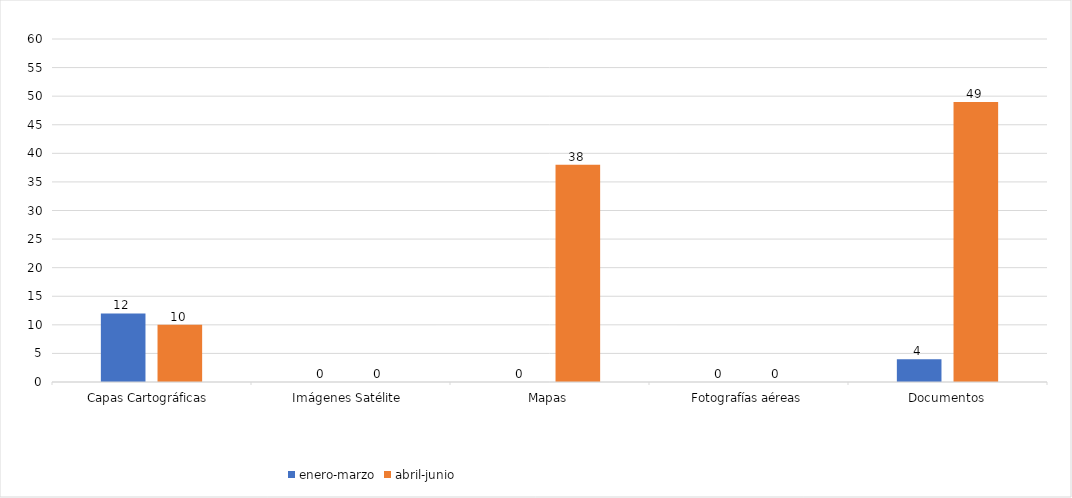
| Category | enero-marzo | abril-junio |
|---|---|---|
| Capas Cartográficas  | 12 | 10 |
| Imágenes Satélite  | 0 | 0 |
| Mapas | 0 | 38 |
| Fotografías aéreas | 0 | 0 |
| Documentos | 4 | 49 |